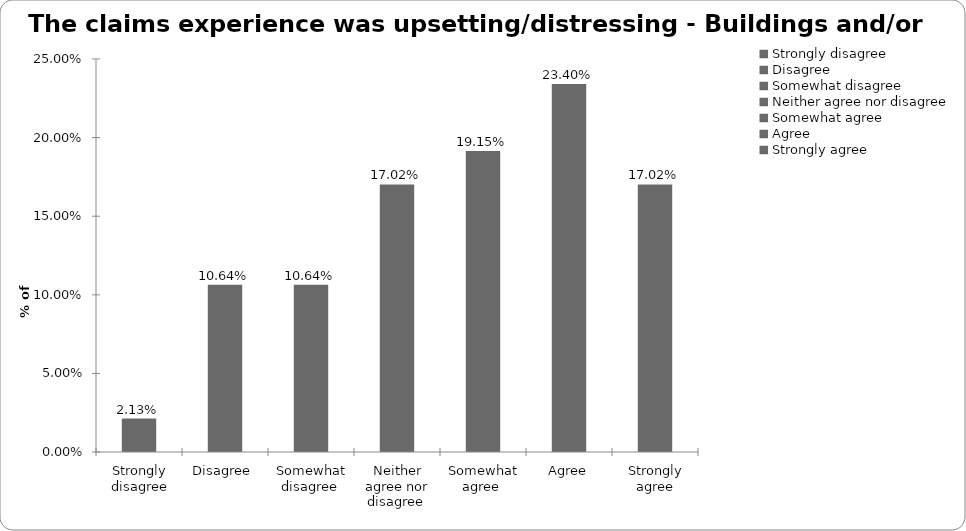
| Category | Series 0 |
|---|---|
| Strongly disagree | 0.021 |
| Disagree  | 0.106 |
| Somewhat disagree  | 0.106 |
| Neither agree nor disagree  | 0.17 |
| Somewhat agree  | 0.191 |
| Agree | 0.234 |
| Strongly agree | 0.17 |